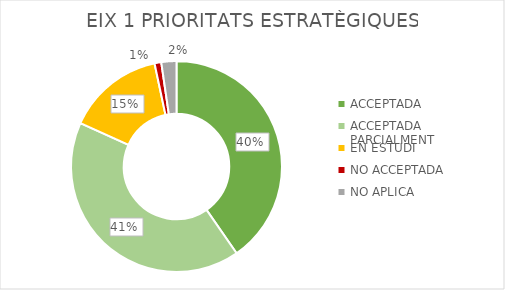
| Category | EIX 1 PRIORITATS ESTRATÈGIQUES |
|---|---|
| ACCEPTADA | 157 |
| ACCEPTADA PARCIALMENT | 161 |
| EN ESTUDI | 58 |
| NO ACCEPTADA | 4 |
| NO APLICA | 9 |